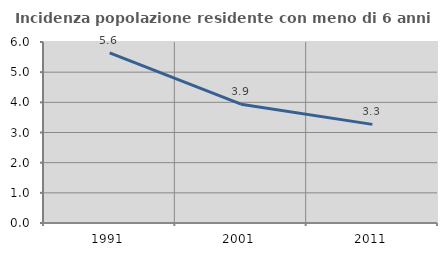
| Category | Incidenza popolazione residente con meno di 6 anni |
|---|---|
| 1991.0 | 5.637 |
| 2001.0 | 3.938 |
| 2011.0 | 3.269 |